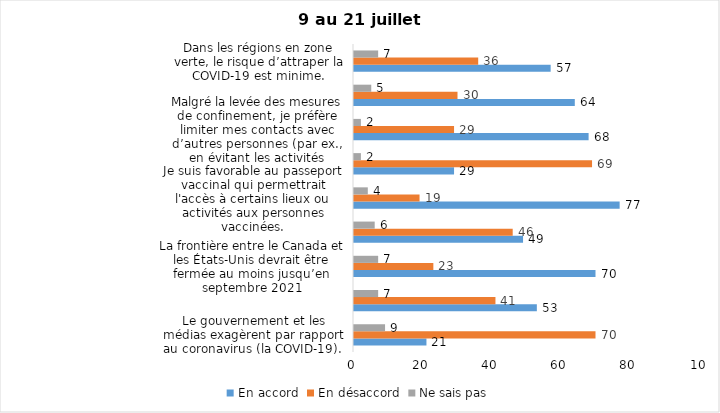
| Category | En accord | En désaccord | Ne sais pas |
|---|---|---|---|
| Le gouvernement et les médias exagèrent par rapport au coronavirus (la COVID-19). | 21 | 70 | 9 |
| J’ai peur que le système de santé soit débordé par les cas de COVID-19 suite au "déconfinement" | 53 | 41 | 7 |
| La frontière entre le Canada et les États-Unis devrait être fermée au moins jusqu’en septembre 2021 | 70 | 23 | 7 |
| Les personnes vaccinées contre la COVID-19 devraient avoir le droit de faire des rassemblements privés et de ne plus porter le masque dans les lieux publics. | 49 | 46 | 6 |
| Je suis favorable au passeport vaccinal qui permettrait l'accès à certains lieux ou activités aux personnes vaccinées. | 77 | 19 | 4 |
| Étant donné la progression de la vaccination et la diminution du nombre de cas de COVID-19, je pense qu’il est moins important de suivre les mesures de prévention. | 29 | 69 | 2 |
| Malgré la levée des mesures de confinement, je préfère limiter mes contacts avec d’autres personnes (par ex., en évitant les activités sociales et de groupes) | 68 | 29 | 2 |
| J’ai peur qu’il y ait une 4e vague de la COVID-19. | 64 | 30 | 5 |
| Dans les régions en zone verte, le risque d’attraper la COVID-19 est minime. | 57 | 36 | 7 |